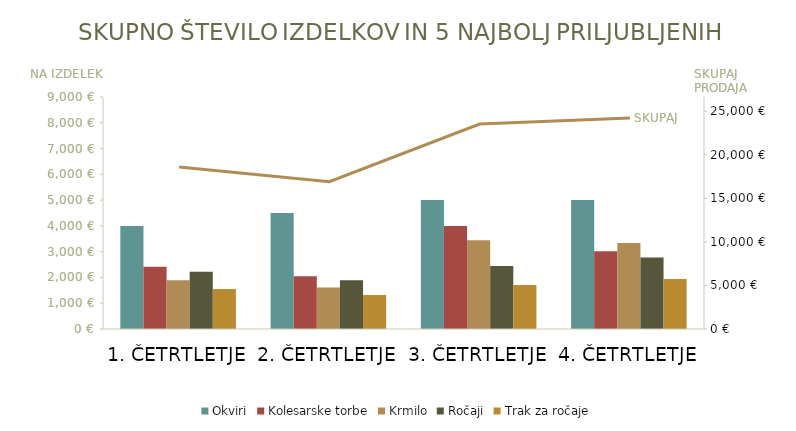
| Category | Okviri | Kolesarske torbe | Krmilo | Ročaji | Trak za ročaje |
|---|---|---|---|---|---|
| 1. ČETRTLETJE | 4000 | 2413 | 1895 | 2222 | 1550.4 |
| 2. ČETRTLETJE | 4500 | 2051.05 | 1610.75 | 1888.7 | 1317.84 |
| 3. ČETRTLETJE | 5000 | 4000 | 3445 | 2444.2 | 1705.44 |
| 4. ČETRTLETJE | 5000 | 3016.25 | 3333 | 2777.5 | 1938 |